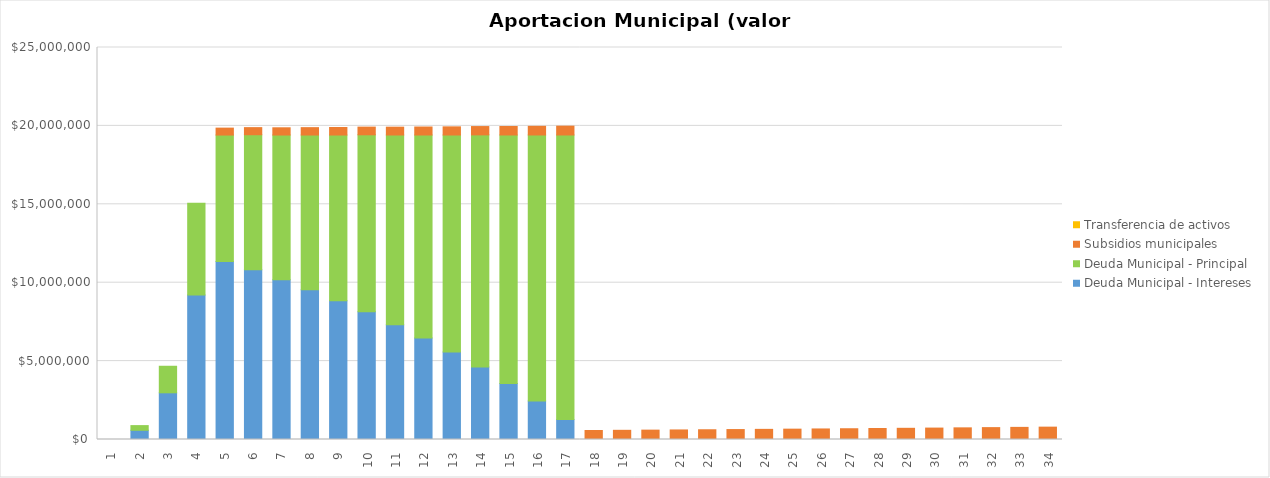
| Category | Deuda Municipal - Intereses | Deuda Municipal - Principal | Subsidios municipales | Transferencia de activos |
|---|---|---|---|---|
| 0 | 0 | 0 | 0 | 0 |
| 1 | 586853.53 | 299272.691 | 0 | 0 |
| 2 | 2978035.864 | 1692997.422 | 0 | 0 |
| 3 | 9222765.754 | 5842614.018 | 0 | 0 |
| 4 | 11359216.849 | 8057067.868 | 441740.534 | 0 |
| 5 | 10825812.701 | 8611003.07 | 452784.048 | 0 |
| 6 | 10192451.884 | 9225174.344 | 461839.729 | 0 |
| 7 | 9546689.68 | 9870936.548 | 471076.523 | 0 |
| 8 | 8855724.121 | 10561902.106 | 480498.054 | 0 |
| 9 | 8139390.527 | 11293164.651 | 490108.015 | 0 |
| 10 | 7325869.448 | 12093254.305 | 499910.175 | 0 |
| 11 | 6479341.647 | 12939782.107 | 509908.379 | 0 |
| 12 | 5573556.9 | 13845566.854 | 520106.546 | 0 |
| 13 | 4617414.693 | 14810405.673 | 530508.677 | 0 |
| 14 | 3567638.823 | 15853142.834 | 541118.851 | 0 |
| 15 | 2457918.824 | 16962862.832 | 551941.228 | 0 |
| 16 | 1270518.426 | 18150263.23 | 562980.052 | 0 |
| 17 | 0 | 0 | 574239.653 | 0 |
| 18 | 0 | 0 | 585724.446 | 0 |
| 19 | 0 | 0 | 597438.935 | 0 |
| 20 | 0 | 0 | 609387.714 | 0 |
| 21 | 0 | 0 | 621575.468 | 0 |
| 22 | 0 | 0 | 634006.978 | 0 |
| 23 | 0 | 0 | 646687.117 | 0 |
| 24 | 0 | 0 | 659620.859 | 0 |
| 25 | 0 | 0 | 672813.277 | 0 |
| 26 | 0 | 0 | 686269.542 | 0 |
| 27 | 0 | 0 | 699994.933 | 0 |
| 28 | 0 | 0 | 713994.832 | 0 |
| 29 | 0 | 0 | 728274.728 | 0 |
| 30 | 0 | 0 | 742840.223 | 0 |
| 31 | 0 | 0 | 757697.027 | 0 |
| 32 | 0 | 0 | 772850.968 | 0 |
| 33 | 0 | 0 | 788307.987 | 0 |